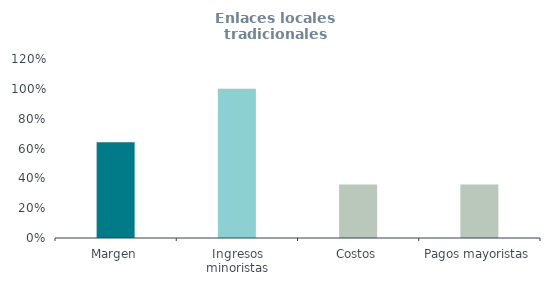
| Category | Enlaces locales tradicionales
(% ingresos) |
|---|---|
| Margen | 0.642 |
| Ingresos minoristas | 1 |
| Costos | 0.358 |
| Pagos mayoristas | 0.358 |